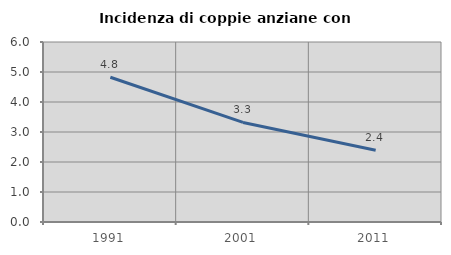
| Category | Incidenza di coppie anziane con figli |
|---|---|
| 1991.0 | 4.825 |
| 2001.0 | 3.32 |
| 2011.0 | 2.39 |